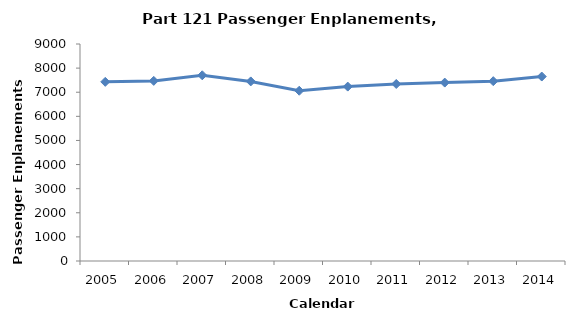
| Category | Passengers (100,000s) |
|---|---|
| 2005.0 | 7430 |
| 2006.0 | 7470 |
| 2007.0 | 7702.619 |
| 2008.0 | 7448.246 |
| 2009.0 | 7061.064 |
| 2010.0 | 7232.912 |
| 2011.0 | 7341.547 |
| 2012.0 | 7399.775 |
| 2013.0 | 7457.827 |
| 2014.0 | 7650.179 |